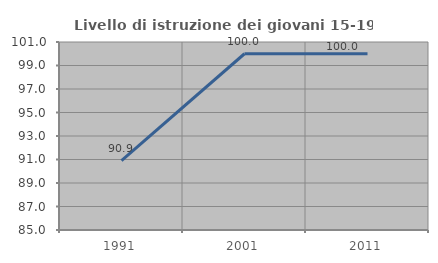
| Category | Livello di istruzione dei giovani 15-19 anni |
|---|---|
| 1991.0 | 90.909 |
| 2001.0 | 100 |
| 2011.0 | 100 |